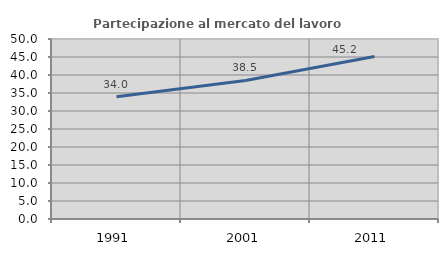
| Category | Partecipazione al mercato del lavoro  femminile |
|---|---|
| 1991.0 | 33.951 |
| 2001.0 | 38.497 |
| 2011.0 | 45.156 |